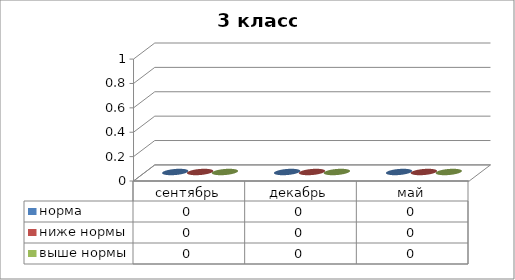
| Category | норма  | ниже нормы | выше нормы |
|---|---|---|---|
| сентябрь | 0 | 0 | 0 |
| декабрь | 0 | 0 | 0 |
| май | 0 | 0 | 0 |